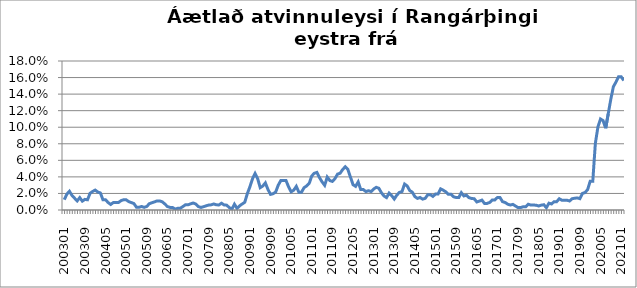
| Category | Series 0 |
|---|---|
| 200301 | 0.012 |
| 200302 | 0.019 |
| 200303 | 0.023 |
| 200304 | 0.018 |
| 200305 | 0.014 |
| 200306 | 0.011 |
| 200307 | 0.015 |
| 200308 | 0.011 |
| 200309 | 0.013 |
| 200310 | 0.012 |
| 200311 | 0.02 |
| 200312 | 0.022 |
| 200401 | 0.024 |
| 200402 | 0.022 |
| 200403 | 0.021 |
| 200404 | 0.012 |
| 200405 | 0.012 |
| 200406 | 0.009 |
| 200407 | 0.007 |
| 200408 | 0.009 |
| 200409 | 0.009 |
| 200410 | 0.009 |
| 200411 | 0.011 |
| 200412 | 0.012 |
| 200501 | 0.012 |
| 200502 | 0.01 |
| 200503 | 0.009 |
| 200504 | 0.008 |
| 200505 | 0.003 |
| 200506 | 0.003 |
| 200507 | 0.004 |
| 200508 | 0.003 |
| 200509 | 0.004 |
| 200510 | 0.008 |
| 200511 | 0.009 |
| 200512 | 0.01 |
| 200601 | 0.011 |
| 200602 | 0.011 |
| 200603 | 0.01 |
| 200604 | 0.007 |
| 200605 | 0.004 |
| 200606 | 0.003 |
| 200607 | 0.003 |
| 200608 | 0.001 |
| 200609 | 0.002 |
| 200610 | 0.002 |
| 200611 | 0.004 |
| 200612 | 0.006 |
| 200701 | 0.006 |
| 200702 | 0.007 |
| 200703 | 0.008 |
| 200704 | 0.007 |
| 200705 | 0.004 |
| 200706 | 0.003 |
| 200707 | 0.004 |
| 200708 | 0.005 |
| 200709 | 0.006 |
| 200710 | 0.006 |
| 200711 | 0.007 |
| 200712 | 0.006 |
| 200801 | 0.006 |
| 200802 | 0.008 |
| 200803 | 0.006 |
| 200804 | 0.006 |
| 200805 | 0.003 |
| 200806 | 0.001 |
| 200807 | 0.007 |
| 200808 | 0.002 |
| 200809 | 0.005 |
| 200810 | 0.007 |
| 200811 | 0.009 |
| 200812 | 0.02 |
| 200901 | 0.028 |
| 200902 | 0.038 |
| 200903 | 0.044 |
| 200904 | 0.038 |
| 200905 | 0.027 |
| 200906 | 0.029 |
| 200907 | 0.033 |
| 200908 | 0.025 |
| 200909 | 0.019 |
| 200910 | 0.02 |
| 200911 | 0.022 |
| 200912 | 0.03 |
| 201001 | 0.036 |
| 201002 | 0.036 |
| 201003 | 0.036 |
| 201004 | 0.028 |
| 201005 | 0.022 |
| 201006 | 0.024 |
| 201007 | 0.029 |
| 201008 | 0.021 |
| 201009 | 0.021 |
| 201010 | 0.027 |
| 201011 | 0.029 |
| 201012 | 0.032 |
| 201101 | 0.041 |
| 201102 | 0.044 |
| 201103 | 0.045 |
| 201104 | 0.039 |
| 201105 | 0.034 |
| 201106 | 0.03 |
| 201107 | 0.04 |
| 201108 | 0.036 |
| 201109 | 0.035 |
| 201110 | 0.038 |
| 201111 | 0.043 |
| 201112 | 0.044 |
| 201201 | 0.049 |
| 201202 | 0.052 |
| 201203 | 0.049 |
| 201204 | 0.04 |
| 201205 | 0.031 |
| 201206 | 0.029 |
| 201207 | 0.034 |
| 201208 | 0.025 |
| 201209 | 0.025 |
| 201210 | 0.022 |
| 201211 | 0.023 |
| 201212 | 0.022 |
| 201301 | 0.025 |
| 201302 | 0.027 |
| 201303 | 0.026 |
| 201304 | 0.021 |
| 201305 | 0.017 |
| 201306 | 0.015 |
| 201307 | 0.02 |
| 201308 | 0.017 |
| 201309 | 0.013 |
| 201310 | 0.018 |
| 201311 | 0.021 |
| 201312 | 0.022 |
| 201401 | 0.031 |
| 201402 | 0.029 |
| 201403 | 0.024 |
| 201404 | 0.022 |
| 201405 | 0.016 |
| 201406 | 0.014 |
| 201407 | 0.015 |
| 201408 | 0.013 |
| 201409 | 0.014 |
| 201410 | 0.018 |
| 201411 | 0.018 |
| 201412 | 0.016 |
| 201501 | 0.019 |
| 201502 | 0.019 |
| 201503 | 0.026 |
| 201504 | 0.024 |
| 201505 | 0.022 |
| 201506 | 0.019 |
| 201507 | 0.019 |
| 201508 | 0.016 |
| 201509 | 0.015 |
| 201510 | 0.015 |
| 201511 | 0.021 |
| 201512 | 0.017 |
| 201601 | 0.018 |
| 201602 | 0.015 |
| 201603 | 0.014 |
| 201604 | 0.014 |
| 201605 | 0.01 |
| 201606 | 0.011 |
| 201607 | 0.012 |
| 201608 | 0.008 |
| 201609 | 0.008 |
| 201610 | 0.009 |
| 201611 | 0.012 |
| 201612 | 0.012 |
| 201701 | 0.015 |
| 201702 | 0.015 |
| 201703 | 0.01 |
| 201704 | 0.009 |
| 201705 | 0.007 |
| 201706 | 0.006 |
| 201707 | 0.007 |
| 201708 | 0.005 |
| 201709 | 0.003 |
| 201710 | 0.003 |
| 201711 | 0.004 |
| 201712 | 0.004 |
| 201801 | 0.007 |
| 201802 | 0.006 |
| 201803 | 0.006 |
| 201804 | 0.006 |
| 201805 | 0.005 |
| 201806 | 0.006 |
| 201807 | 0.006 |
| 201808 | 0.003 |
| 201809 | 0.008 |
| 201810 | 0.007 |
| 201811 | 0.01 |
| 201812 | 0.01 |
| 201901 | 0.014 |
| 201902 | 0.012 |
| 201903 | 0.012 |
| 201904 | 0.012 |
| 201905 | 0.011 |
| 201906 | 0.014 |
| 201907 | 0.014 |
| 201908 | 0.015 |
| 201909 | 0.014 |
| 201910 | 0.02 |
| 201911 | 0.021 |
| 201912 | 0.025 |
| 202001 | 0.035 |
| 202002 | 0.035 |
| 202003 | 0.081 |
| 202004 | 0.1 |
| 202005 | 0.11 |
| 202006 | 0.108 |
| 202007 | 0.099 |
| 202008 | 0.116 |
| 202009 | 0.134 |
| 202010 | 0.149 |
| 202011 | 0.155 |
| 202012 | 0.161 |
| 202101 | 0.161 |
| 202102 | 0.156 |